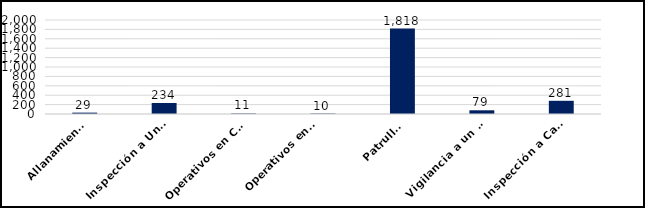
| Category | Series 0 |
|---|---|
| Allanamientos | 29 |
| Inspección a Unidades que transportan Combustibles y Mercancias  | 234 |
| Operativos en Comisión Mixta Interinstitucional | 11 |
| Operativos en Apoyo a la DSCEEC 
 | 10 |
| Patrullas | 1818 |
| Vigilancia a un Punto de Interés  | 79 |
| Inspección a Camiones de Desechos Oleosos | 281 |